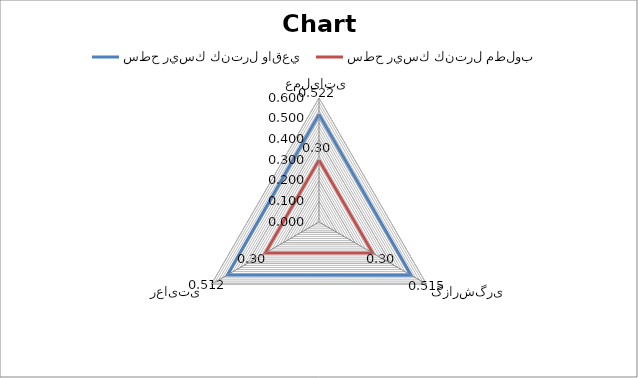
| Category | سطح ريسك كنترل واقعي |  سطح ريسك كنترل مطلوب  |
|---|---|---|
| عملیاتی | 0.522 | 0.3 |
| گزارشگری | 0.515 | 0.3 |
| رعایتی | 0.512 | 0.3 |